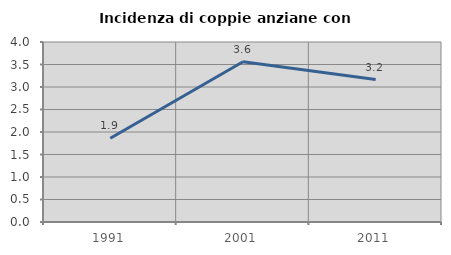
| Category | Incidenza di coppie anziane con figli |
|---|---|
| 1991.0 | 1.861 |
| 2001.0 | 3.562 |
| 2011.0 | 3.164 |